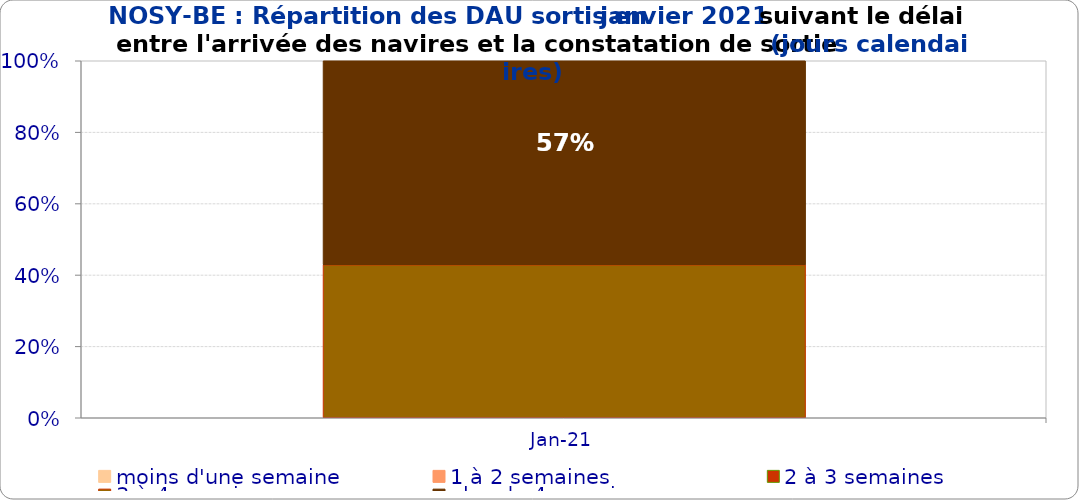
| Category | moins d'une semaine | 1 à 2 semaines | 2 à 3 semaines | 3 à 4 semaines | plus de 4 semaines |
|---|---|---|---|---|---|
| 2021-01-01 | 0 | 0 | 0 | 0.429 | 0.571 |